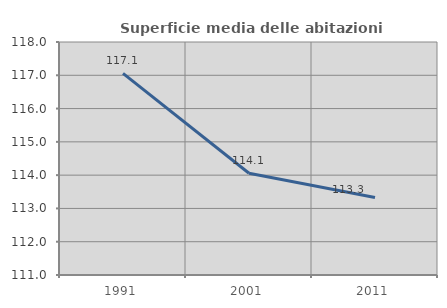
| Category | Superficie media delle abitazioni occupate |
|---|---|
| 1991.0 | 117.058 |
| 2001.0 | 114.055 |
| 2011.0 | 113.326 |